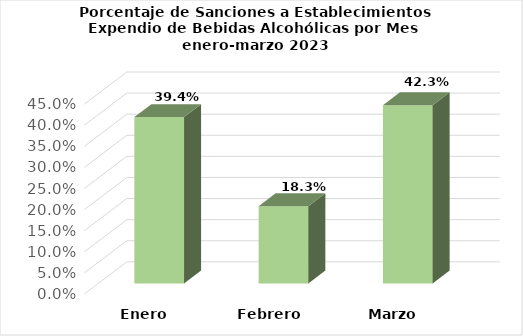
| Category | Series 0 |
|---|---|
| Enero | 0.394 |
| Febrero | 0.183 |
| Marzo | 0.423 |